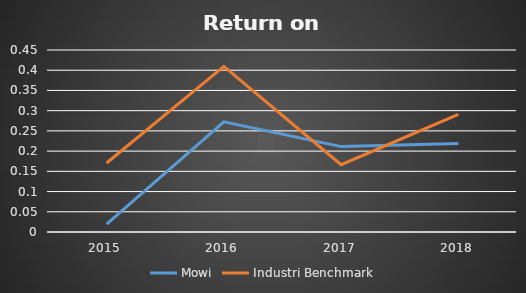
| Category | Mowi | Industri Benchmark |
|---|---|---|
| 2015.0 | 0.019 | 0.171 |
| 2016.0 | 0.272 | 0.409 |
| 2017.0 | 0.211 | 0.167 |
| 2018.0 | 0.219 | 0.291 |